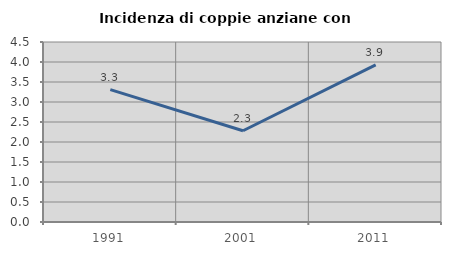
| Category | Incidenza di coppie anziane con figli |
|---|---|
| 1991.0 | 3.309 |
| 2001.0 | 2.281 |
| 2011.0 | 3.93 |